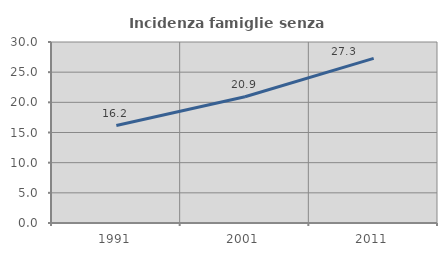
| Category | Incidenza famiglie senza nuclei |
|---|---|
| 1991.0 | 16.16 |
| 2001.0 | 20.934 |
| 2011.0 | 27.283 |